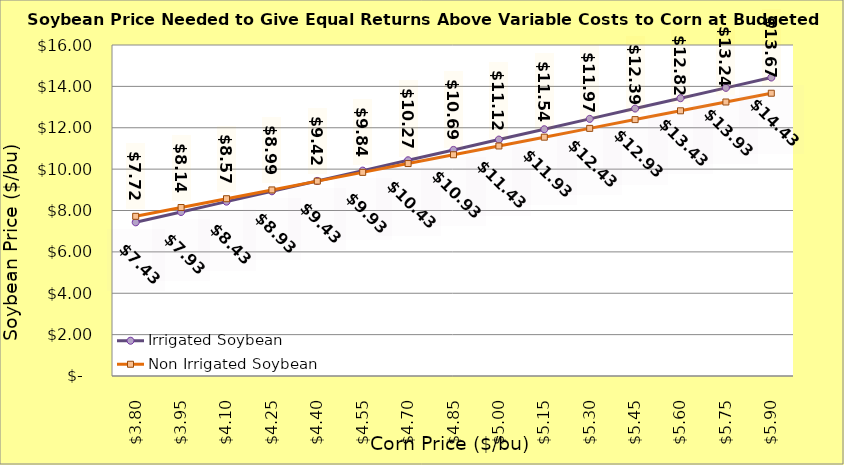
| Category | Irrigated Soybean | Non Irrigated Soybean |
|---|---|---|
| 3.799999999999998 | 7.428 | 7.719 |
| 3.949999999999998 | 7.928 | 8.144 |
| 4.099999999999998 | 8.428 | 8.569 |
| 4.249999999999998 | 8.928 | 8.994 |
| 4.399999999999999 | 9.428 | 9.419 |
| 4.549999999999999 | 9.928 | 9.844 |
| 4.699999999999999 | 10.428 | 10.269 |
| 4.85 | 10.928 | 10.694 |
| 5.0 | 11.428 | 11.119 |
| 5.15 | 11.928 | 11.544 |
| 5.300000000000001 | 12.428 | 11.969 |
| 5.450000000000001 | 12.928 | 12.394 |
| 5.600000000000001 | 13.428 | 12.819 |
| 5.750000000000002 | 13.928 | 13.244 |
| 5.900000000000002 | 14.428 | 13.669 |